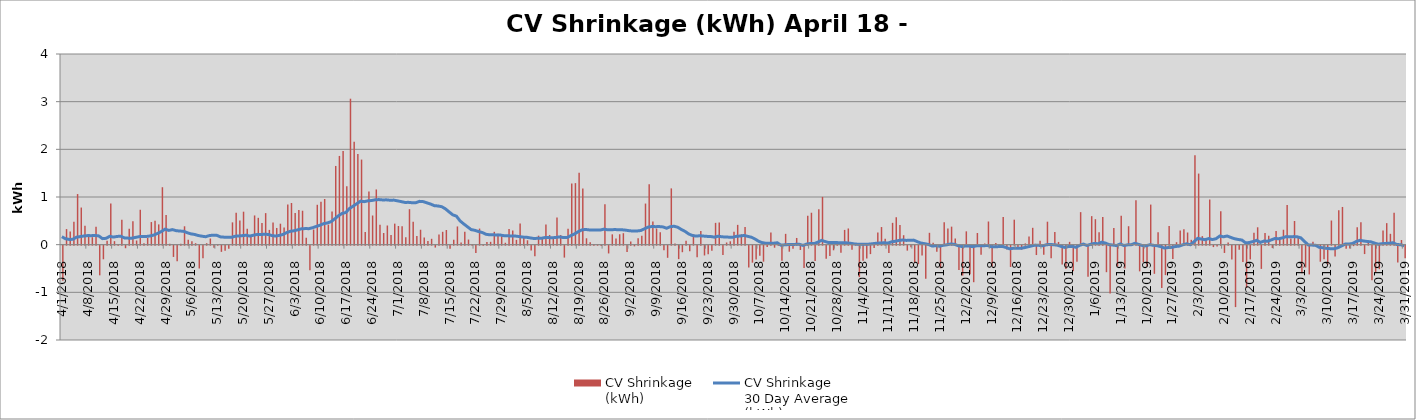
| Category | CV Shrinkage
(kWh) |
|---|---|
| 4/1/18 | -738624 |
| 4/2/18 | 327398 |
| 4/3/18 | 275905 |
| 4/4/18 | 483044 |
| 4/5/18 | 1061787 |
| 4/6/18 | 778778 |
| 4/7/18 | 397072 |
| 4/8/18 | 209880 |
| 4/9/18 | 157006 |
| 4/10/18 | 374594 |
| 4/11/18 | -622327 |
| 4/12/18 | -285900 |
| 4/13/18 | 82775 |
| 4/14/18 | 862938 |
| 4/15/18 | 74009 |
| 4/16/18 | 5038 |
| 4/17/18 | 521427 |
| 4/18/18 | -53796 |
| 4/19/18 | 332758 |
| 4/20/18 | 493042 |
| 4/21/18 | 86841 |
| 4/22/18 | 732288 |
| 4/23/18 | 28193 |
| 4/24/18 | 140202 |
| 4/25/18 | 474373 |
| 4/26/18 | 500354 |
| 4/27/18 | 425305 |
| 4/28/18 | 1205024 |
| 4/29/18 | 621369 |
| 4/30/18 | 17919 |
| 5/1/18 | -236377 |
| 5/2/18 | -328942 |
| 5/3/18 | 21756 |
| 5/4/18 | 385441 |
| 5/5/18 | 103540 |
| 5/6/18 | 73454 |
| 5/7/18 | 30705 |
| 5/8/18 | -478550 |
| 5/9/18 | -262385 |
| 5/10/18 | 30476 |
| 5/11/18 | 129299 |
| 5/12/18 | -45274 |
| 5/13/18 | 3598 |
| 5/14/18 | -129751 |
| 5/15/18 | -104212 |
| 5/16/18 | -65912 |
| 5/17/18 | 467987 |
| 5/18/18 | 671040 |
| 5/19/18 | 504429 |
| 5/20/18 | 691920 |
| 5/21/18 | 332104 |
| 5/22/18 | 197358 |
| 5/23/18 | 612924 |
| 5/24/18 | 563123 |
| 5/25/18 | 453831 |
| 5/26/18 | 661923 |
| 5/27/18 | 309941 |
| 5/28/18 | 464684 |
| 5/29/18 | 350622 |
| 5/30/18 | 439959 |
| 5/31/18 | 360994 |
| 6/1/18 | 840937 |
| 6/2/18 | 873832 |
| 6/3/18 | 662326 |
| 6/4/18 | 724701 |
| 6/5/18 | 711959 |
| 6/6/18 | 145761 |
| 6/7/18 | -517452 |
| 6/8/18 | 317686 |
| 6/9/18 | 836629 |
| 6/10/18 | 901414 |
| 6/11/18 | 958595 |
| 6/12/18 | 420055 |
| 6/13/18 | 698009 |
| 6/14/18 | 1651359 |
| 6/15/18 | 1861656 |
| 6/16/18 | 1963904 |
| 6/17/18 | 1226810 |
| 6/18/18 | 3062184 |
| 6/19/18 | 2156930 |
| 6/20/18 | 1902489 |
| 6/21/18 | 1785249 |
| 6/22/18 | 264963 |
| 6/23/18 | 1115444 |
| 6/24/18 | 611814 |
| 6/25/18 | 1158590 |
| 6/26/18 | 420023 |
| 6/27/18 | 244432 |
| 6/28/18 | 402134 |
| 6/29/18 | 203984 |
| 6/30/18 | 441420 |
| 7/1/18 | 391104 |
| 7/2/18 | 386340 |
| 7/3/18 | 154873 |
| 7/4/18 | 744443 |
| 7/5/18 | 481865 |
| 7/6/18 | 180750 |
| 7/7/18 | 313233 |
| 7/8/18 | 148220 |
| 7/9/18 | 79101 |
| 7/10/18 | 123342 |
| 7/11/18 | -40028 |
| 7/12/18 | 211682 |
| 7/13/18 | 269971 |
| 7/14/18 | 307261 |
| 7/15/18 | -66606 |
| 7/16/18 | 103603 |
| 7/17/18 | 382337 |
| 7/18/18 | 43512 |
| 7/19/18 | 272191 |
| 7/20/18 | 107558 |
| 7/21/18 | 12085 |
| 7/22/18 | -155908 |
| 7/23/18 | 337358 |
| 7/24/18 | -4176 |
| 7/25/18 | 56800 |
| 7/26/18 | 59689 |
| 7/27/18 | 269942 |
| 7/28/18 | 229305 |
| 7/29/18 | 176821 |
| 7/30/18 | 40046 |
| 7/31/18 | 326197 |
| 8/1/18 | 295806 |
| 8/2/18 | 100952 |
| 8/3/18 | 441545 |
| 8/4/18 | 140363 |
| 8/5/18 | 91986 |
| 8/6/18 | -101728 |
| 8/7/18 | -224268 |
| 8/8/18 | 188706 |
| 8/9/18 | 134310 |
| 8/10/18 | 424861 |
| 8/11/18 | 203824 |
| 8/12/18 | 129710 |
| 8/13/18 | 572088 |
| 8/14/18 | 201122 |
| 8/15/18 | -250139 |
| 8/16/18 | 334679 |
| 8/17/18 | 1283974 |
| 8/18/18 | 1291283 |
| 8/19/18 | 1507228 |
| 8/20/18 | 1176966 |
| 8/21/18 | 134150 |
| 8/22/18 | 49897 |
| 8/23/18 | 14209 |
| 8/24/18 | 9234 |
| 8/25/18 | -7150 |
| 8/26/18 | 848840 |
| 8/27/18 | -163165 |
| 8/28/18 | 216774 |
| 8/29/18 | 130374 |
| 8/30/18 | 218838 |
| 8/31/18 | 240514 |
| 9/1/18 | -133110 |
| 9/2/18 | 67399 |
| 9/3/18 | -14203 |
| 9/4/18 | 133911 |
| 9/5/18 | 186571 |
| 9/6/18 | 862590 |
| 9/7/18 | 1269880 |
| 9/8/18 | 483732 |
| 9/9/18 | 337976 |
| 9/10/18 | 259474 |
| 9/11/18 | -96387 |
| 9/12/18 | -254560 |
| 9/13/18 | 1180955 |
| 9/14/18 | 24479 |
| 9/15/18 | -282685 |
| 9/16/18 | -137333 |
| 9/17/18 | 81234 |
| 9/18/18 | -118221 |
| 9/19/18 | 216348 |
| 9/20/18 | -241002 |
| 9/21/18 | 288463 |
| 9/22/18 | -205692 |
| 9/23/18 | -181987 |
| 9/24/18 | -107507 |
| 9/25/18 | 457747 |
| 9/26/18 | 463636 |
| 9/27/18 | -196796 |
| 9/28/18 | 45502 |
| 9/29/18 | 70505 |
| 9/30/18 | 273197 |
| 10/1/18 | 415397 |
| 10/2/18 | 216198 |
| 10/3/18 | 370783 |
| 10/4/18 | -457516 |
| 10/5/18 | -357033 |
| 10/6/18 | -287787 |
| 10/7/18 | -212845 |
| 10/8/18 | -336077 |
| 10/9/18 | -29195 |
| 10/10/18 | 254191 |
| 10/11/18 | -43119 |
| 10/12/18 | 37078 |
| 10/13/18 | -316371 |
| 10/14/18 | 227043 |
| 10/15/18 | -126396 |
| 10/16/18 | -65494 |
| 10/17/18 | 140825 |
| 10/18/18 | -90894 |
| 10/19/18 | -467440 |
| 10/20/18 | 607877 |
| 10/21/18 | 669902 |
| 10/22/18 | -319394 |
| 10/23/18 | 743968 |
| 10/24/18 | 1002436 |
| 10/25/18 | -272970 |
| 10/26/18 | -214446 |
| 10/27/18 | -97246 |
| 10/28/18 | 38780 |
| 10/29/18 | -147842 |
| 10/30/18 | 309635 |
| 10/31/18 | 339786 |
| 11/1/18 | -85017 |
| 11/2/18 | 10308 |
| 11/3/18 | -660837 |
| 11/4/18 | -318831 |
| 11/5/18 | -266773 |
| 11/6/18 | -177195 |
| 11/7/18 | -48645 |
| 11/8/18 | 252798 |
| 11/9/18 | 369736 |
| 11/10/18 | 124248 |
| 11/11/18 | -154932 |
| 11/12/18 | 458031 |
| 11/13/18 | 577790 |
| 11/14/18 | 410978 |
| 11/15/18 | 198282 |
| 11/16/18 | -104130 |
| 11/17/18 | -33389 |
| 11/18/18 | -351071 |
| 11/19/18 | -387426 |
| 11/20/18 | -205924 |
| 11/21/18 | -694088 |
| 11/22/18 | 248735 |
| 11/23/18 | 37691 |
| 11/24/18 | -127894 |
| 11/25/18 | -474183 |
| 11/26/18 | 470911 |
| 11/27/18 | 338754 |
| 11/28/18 | 378146 |
| 11/29/18 | 129384 |
| 11/30/18 | -510152 |
| 12/1/18 | -626855 |
| 12/2/18 | 279543 |
| 12/3/18 | -599804 |
| 12/4/18 | -766668 |
| 12/5/18 | 244243 |
| 12/6/18 | -192888 |
| 12/7/18 | 22168 |
| 12/8/18 | 486105 |
| 12/9/18 | -436784 |
| 12/10/18 | 33558 |
| 12/11/18 | -16558 |
| 12/12/18 | 580593 |
| 12/13/18 | -80081 |
| 12/14/18 | -445856 |
| 12/15/18 | 524102 |
| 12/16/18 | -40622 |
| 12/17/18 | -85371 |
| 12/18/18 | 26299 |
| 12/19/18 | 170251 |
| 12/20/18 | 353642 |
| 12/21/18 | -196769 |
| 12/22/18 | 83488 |
| 12/23/18 | -193006 |
| 12/24/18 | 482054 |
| 12/25/18 | -261806 |
| 12/26/18 | 264439 |
| 12/27/18 | 57187 |
| 12/28/18 | -393733 |
| 12/29/18 | -489025 |
| 12/30/18 | 59077 |
| 12/31/18 | -534779 |
| 1/1/19 | -338305.278 |
| 1/2/19 | 682487 |
| 1/3/19 | 19273 |
| 1/4/19 | -651745.556 |
| 1/5/19 | 598457.778 |
| 1/6/19 | 534385.278 |
| 1/7/19 | 260216 |
| 1/8/19 | 580037 |
| 1/9/19 | -556347 |
| 1/10/19 | -1001664 |
| 1/11/19 | 347929 |
| 1/12/19 | -440442 |
| 1/13/19 | 606334 |
| 1/14/19 | -479600 |
| 1/15/19 | 387087 |
| 1/16/19 | 116 |
| 1/17/19 | 933615.833 |
| 1/18/19 | -539149 |
| 1/19/19 | -348218 |
| 1/20/19 | -440268 |
| 1/21/19 | 840899 |
| 1/22/19 | -590610 |
| 1/23/19 | 259127 |
| 1/24/19 | -886763 |
| 1/25/19 | -617721 |
| 1/26/19 | 390344 |
| 1/27/19 | -277650 |
| 1/28/19 | 52011 |
| 1/29/19 | 295192 |
| 1/30/19 | 324313 |
| 1/31/19 | 255369 |
| 2/1/19 | 101823 |
| 2/2/19 | 1876608.611 |
| 2/3/19 | 1491211.944 |
| 2/4/19 | 178908.056 |
| 2/5/19 | 135231.944 |
| 2/6/19 | 947173.056 |
| 2/7/19 | -29821.389 |
| 2/8/19 | -15497.222 |
| 2/9/19 | 701732.222 |
| 2/10/19 | -153098.889 |
| 2/11/19 | 45839.722 |
| 2/12/19 | -288849.167 |
| 2/13/19 | -1288896.667 |
| 2/14/19 | -85701 |
| 2/15/19 | -344718 |
| 2/16/19 | -886933 |
| 2/17/19 | -288919 |
| 2/18/19 | 249044.167 |
| 2/19/19 | 364590 |
| 2/20/19 | -487257.417 |
| 2/21/19 | 245907.778 |
| 2/22/19 | 187473.056 |
| 2/23/19 | -47996.944 |
| 2/24/19 | 284233 |
| 2/25/19 | 154893.611 |
| 2/26/19 | 313096 |
| 2/27/19 | 832929 |
| 2/28/19 | 130301 |
| 3/1/19 | 496587 |
| 3/2/19 | 139117 |
| 3/3/19 | -576644 |
| 3/4/19 | -457310.556 |
| 3/5/19 | -603760 |
| 3/6/19 | 60678 |
| 3/7/19 | -8914.722 |
| 3/8/19 | -337418.333 |
| 3/9/19 | -285821.944 |
| 3/10/19 | -398856.667 |
| 3/11/19 | 506624 |
| 3/12/19 | -226146.111 |
| 3/13/19 | 723057 |
| 3/14/19 | 790889 |
| 3/15/19 | -67208 |
| 3/16/19 | -58280 |
| 3/17/19 | -9810 |
| 3/18/19 | 365201 |
| 3/19/19 | 469057 |
| 3/20/19 | -176496 |
| 3/21/19 | 44458.889 |
| 3/22/19 | -723411.111 |
| 3/23/19 | -551820.556 |
| 3/24/19 | -493454.444 |
| 3/25/19 | 299684 |
| 3/26/19 | 451672.5 |
| 3/27/19 | 227596 |
| 3/28/19 | 670316 |
| 3/29/19 | -354563 |
| 3/30/19 | 98192 |
| 3/31/19 | -265030.556 |